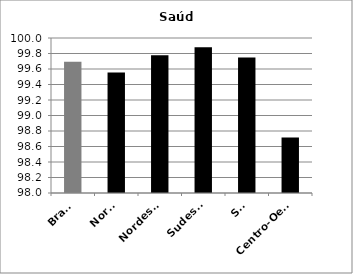
| Category | Saúde |
|---|---|
| Brasil | 99.695 |
| Norte | 99.556 |
| Nordeste | 99.777 |
| Sudeste | 99.88 |
| Sul | 99.748 |
| Centro-Oeste | 98.715 |